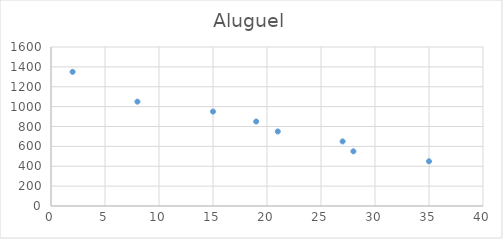
| Category | Aluguel |
|---|---|
| 35.0 | 450 |
| 28.0 | 550 |
| 27.0 | 650 |
| 21.0 | 750 |
| 19.0 | 850 |
| 15.0 | 950 |
| 8.0 | 1050 |
| 2.0 | 1350 |